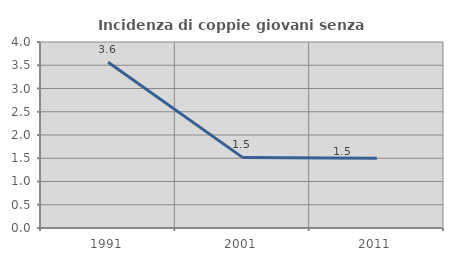
| Category | Incidenza di coppie giovani senza figli |
|---|---|
| 1991.0 | 3.564 |
| 2001.0 | 1.518 |
| 2011.0 | 1.5 |